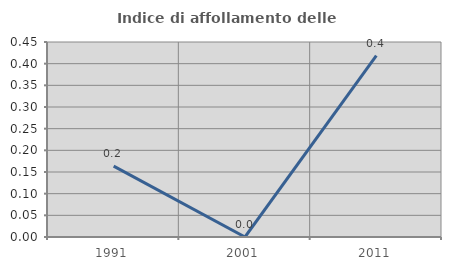
| Category | Indice di affollamento delle abitazioni  |
|---|---|
| 1991.0 | 0.164 |
| 2001.0 | 0 |
| 2011.0 | 0.419 |